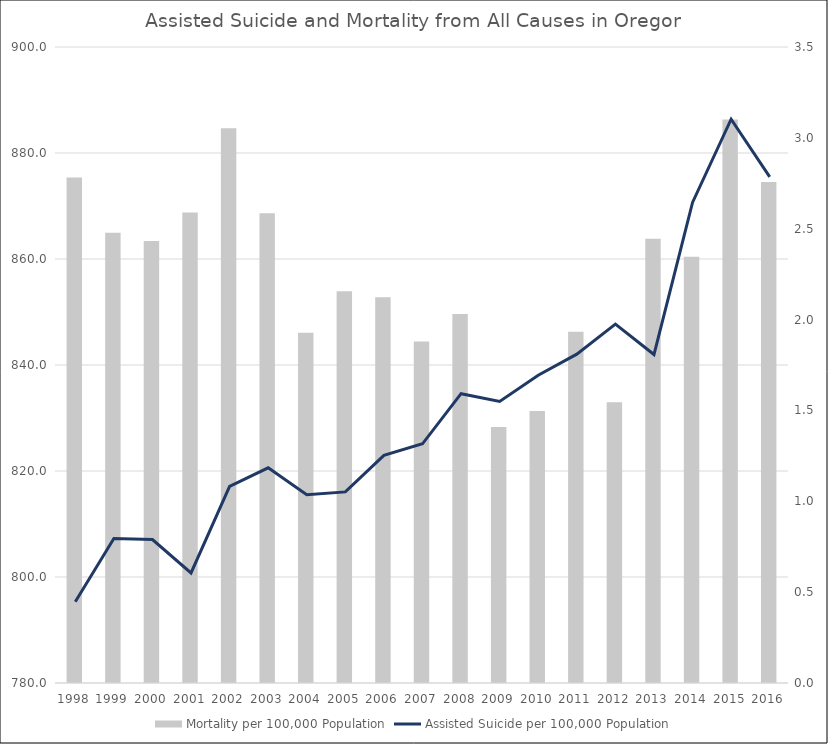
| Category | Mortality per 100,000 Population |
|---|---|
| 1998 | 875.36 |
| 1999 | 864.953 |
| 2000 | 863.419 |
| 2001 | 868.759 |
| 2002 | 884.664 |
| 2003 | 868.614 |
| 2004 | 846.094 |
| 2005 | 853.924 |
| 2006 | 852.765 |
| 2007 | 844.424 |
| 2008 | 849.619 |
| 2009 | 828.31 |
| 2010 | 831.335 |
| 2011 | 846.277 |
| 2012 | 832.973 |
| 2013 | 863.809 |
| 2014 | 860.402 |
| 2015 | 886.304 |
| 2016 | 874.54 |